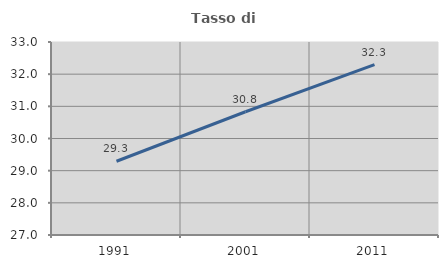
| Category | Tasso di occupazione   |
|---|---|
| 1991.0 | 29.293 |
| 2001.0 | 30.832 |
| 2011.0 | 32.299 |